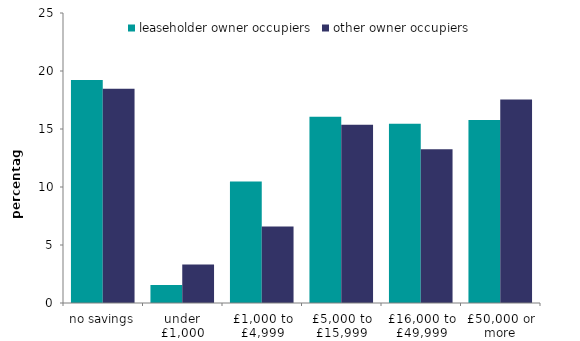
| Category | leaseholder owner occupiers | other owner occupiers |
|---|---|---|
| no savings | 19.22 | 18.466 |
| under £1,000 | 1.547 | 3.326 |
| £1,000 to £4,999 | 10.481 | 6.595 |
| £5,000 to £15,999 | 16.056 | 15.372 |
| £16,000 to £49,999 | 15.456 | 13.247 |
| £50,000 or more | 15.783 | 17.535 |